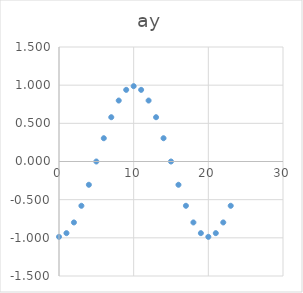
| Category | Series 0 |
|---|---|
| 0.0 | -0.987 |
| 1.0 | -0.939 |
| 2.0 | -0.798 |
| 3.0 | -0.58 |
| 4.0 | -0.305 |
| 5.0 | 0 |
| 6.0 | 0.305 |
| 7.0 | 0.58 |
| 8.0 | 0.798 |
| 9.0 | 0.939 |
| 10.0 | 0.987 |
| 11.0 | 0.939 |
| 12.0 | 0.798 |
| 13.0 | 0.58 |
| 14.0 | 0.305 |
| 15.0 | 0 |
| 16.0 | -0.305 |
| 17.0 | -0.58 |
| 18.0 | -0.798 |
| 19.0 | -0.939 |
| 20.0 | -0.987 |
| 21.0 | -0.939 |
| 22.0 | -0.798 |
| 23.0 | -0.58 |